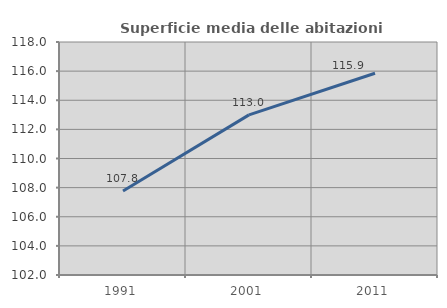
| Category | Superficie media delle abitazioni occupate |
|---|---|
| 1991.0 | 107.768 |
| 2001.0 | 112.995 |
| 2011.0 | 115.853 |